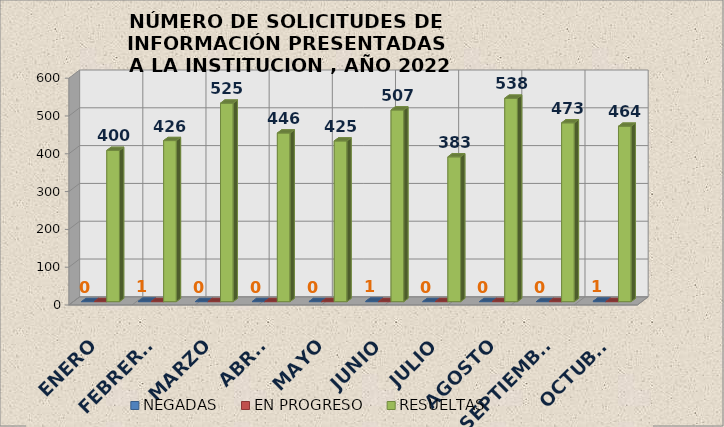
| Category | NEGADAS | EN PROGRESO | RESUELTAS |
|---|---|---|---|
| ENERO | 0 | 0 | 400 |
| FEBRERO | 1 | 0 | 426 |
| MARZO | 0 | 0 | 525 |
| ABRIL | 0 | 0 | 446 |
| MAYO | 0 | 0 | 425 |
| JUNIO | 1 | 0 | 507 |
| JULIO | 0 | 0 | 383 |
| AGOSTO | 0 | 0 | 538 |
| SEPTIEMBRE | 0 | 0 | 473 |
| OCTUBRE | 1 | 0 | 464 |